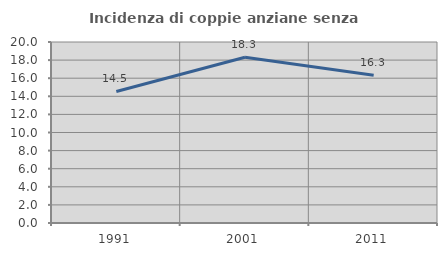
| Category | Incidenza di coppie anziane senza figli  |
|---|---|
| 1991.0 | 14.534 |
| 2001.0 | 18.31 |
| 2011.0 | 16.321 |